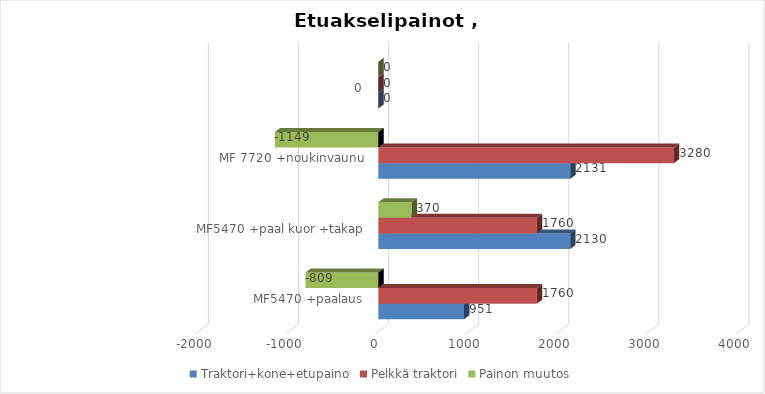
| Category | Traktori+kone+etupaino | Pelkkä traktori | Painon muutos |
|---|---|---|---|
| MF5470 +paalaus | 951.348 | 1760 | -808.652 |
| MF5470 +paal kuor +takap | 2129.625 | 1760 | 369.625 |
| MF 7720 +noukinvaunu | 2130.878 | 3280 | -1149.122 |
| 0 | 0 | 0 | 0 |